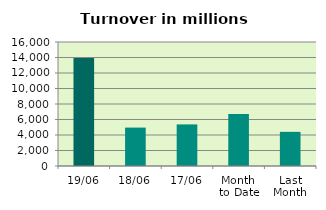
| Category | Series 0 |
|---|---|
| 19/06 | 13929.105 |
| 18/06 | 4955.511 |
| 17/06 | 5366.818 |
| Month 
to Date | 6700.019 |
| Last
Month | 4406.275 |